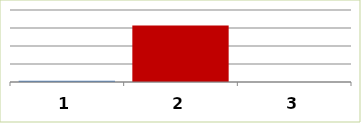
| Category | Series 0 |
|---|---|
| 0 | 654676 |
| 1 | 31419632 |
| 2 | 0 |